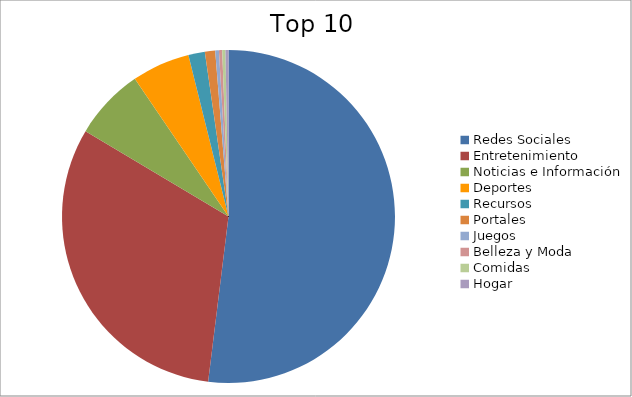
| Category | Series 0 |
|---|---|
| Redes Sociales | 51.63 |
| Entretenimiento | 31.42 |
| Noticias e Información | 6.88 |
| Deportes | 5.6 |
| Recursos | 1.59 |
| Portales | 0.99 |
| Juegos | 0.36 |
| Belleza y Moda | 0.31 |
| Comidas | 0.31 |
| Hogar | 0.29 |